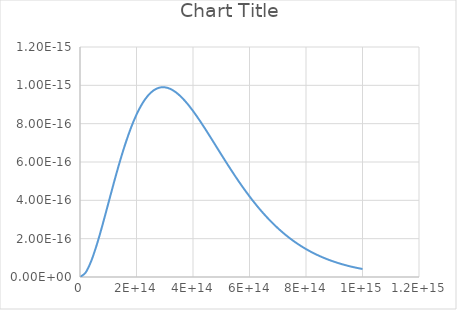
| Category | Series 0 |
|---|---|
| 0.0 | 0 |
| 20000000000000.0 | 0 |
| 40000000000000.0 | 0 |
| 60000000000000.0 | 0 |
| 80000000000000.0 | 0 |
| 100000000000000.0 | 0 |
| 120000000000000.0 | 0 |
| 140000000000000.0 | 0 |
| 160000000000000.0 | 0 |
| 180000000000000.0 | 0 |
| 200000000000000.0 | 0 |
| 220000000000000.0 | 0 |
| 240000000000000.0 | 0 |
| 260000000000000.0 | 0 |
| 280000000000000.0 | 0 |
| 300000000000000.0 | 0 |
| 320000000000000.0 | 0 |
| 340000000000000.0 | 0 |
| 360000000000000.0 | 0 |
| 380000000000000.0 | 0 |
| 400000000000000.0 | 0 |
| 420000000000000.0 | 0 |
| 440000000000000.0 | 0 |
| 460000000000000.0 | 0 |
| 480000000000000.0 | 0 |
| 500000000000000.0 | 0 |
| 520000000000000.0 | 0 |
| 540000000000000.0 | 0 |
| 560000000000000.0 | 0 |
| 580000000000000.0 | 0 |
| 600000000000000.0 | 0 |
| 620000000000000.0 | 0 |
| 640000000000000.0 | 0 |
| 660000000000000.0 | 0 |
| 680000000000000.0 | 0 |
| 700000000000000.0 | 0 |
| 720000000000000.0 | 0 |
| 740000000000000.0 | 0 |
| 760000000000000.0 | 0 |
| 780000000000000.0 | 0 |
| 800000000000000.0 | 0 |
| 820000000000000.0 | 0 |
| 840000000000000.0 | 0 |
| 860000000000000.0 | 0 |
| 880000000000000.0 | 0 |
| 900000000000000.0 | 0 |
| 920000000000000.0 | 0 |
| 940000000000000.0 | 0 |
| 960000000000000.0 | 0 |
| 980000000000000.0 | 0 |
| 1000000000000000.0 | 0 |